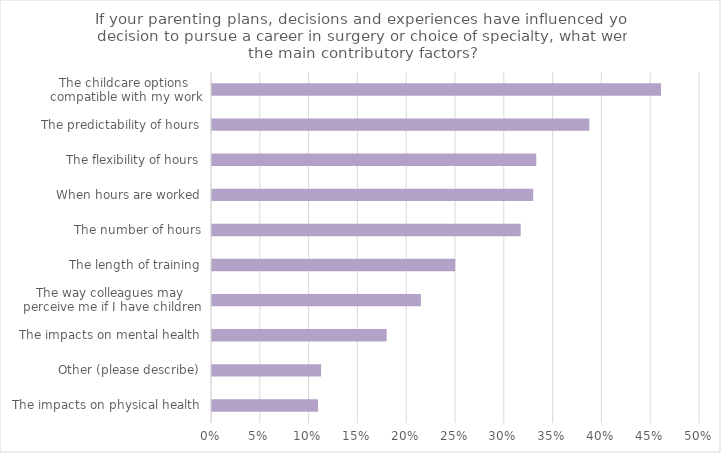
| Category | Series 0 |
|---|---|
| The impacts on physical health | 0.109 |
| Other (please describe) | 0.112 |
| The impacts on mental health | 0.179 |
| The way colleagues may
 perceive me if I have children | 0.214 |
| The length of training | 0.249 |
| The number of hours | 0.316 |
| When hours are worked | 0.329 |
| The flexibility of hours | 0.332 |
| The predictability of hours | 0.387 |
| The childcare options 
compatible with my work | 0.46 |